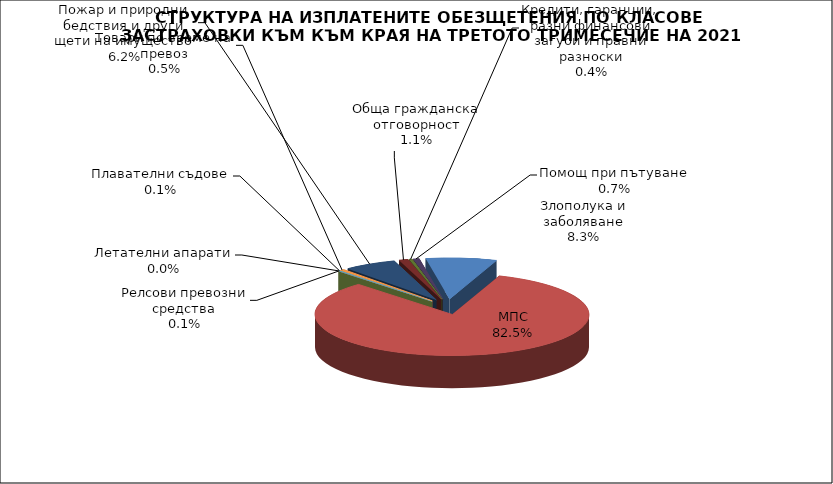
| Category | Злополука и заболяване |
|---|---|
| Злополука и заболяване | 0.083 |
| МПС | 0.825 |
| Релсови превозни средства | 0.001 |
| Летателни апарати | 0 |
| Плавателни съдове | 0.001 |
| Товари по време на превоз | 0.005 |
| Пожар и природни бедствия и други щети на имущество | 0.062 |
| Обща гражданска отговорност | 0.011 |
| Кредити, гаранции, разни финансови загуби и правни разноски | 0.004 |
| Помощ при пътуване | 0.007 |